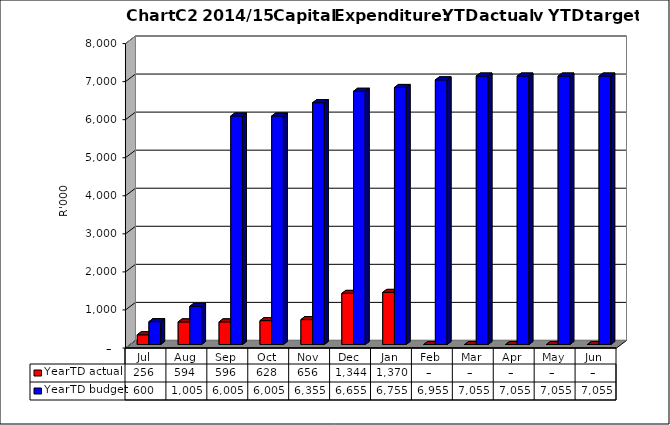
| Category | YearTD actual | YearTD budget |
|---|---|---|
| Jul | 256069.27 | 600000 |
| Aug | 594425.5 | 1005000 |
| Sep | 595825.5 | 6005000 |
| Oct | 627786.5 | 6005000 |
| Nov | 655586.5 | 6355000 |
| Dec | 1343945.32 | 6655000 |
| Jan | 1369945.32 | 6755000 |
| Feb | 0 | 6955000 |
| Mar | 0 | 7055000 |
| Apr | 0 | 7055000 |
| May | 0 | 7055000 |
| Jun | 0 | 7055000 |